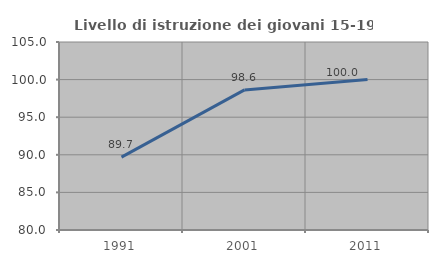
| Category | Livello di istruzione dei giovani 15-19 anni |
|---|---|
| 1991.0 | 89.683 |
| 2001.0 | 98.63 |
| 2011.0 | 100 |